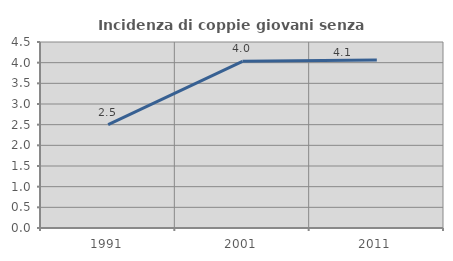
| Category | Incidenza di coppie giovani senza figli |
|---|---|
| 1991.0 | 2.5 |
| 2001.0 | 4.032 |
| 2011.0 | 4.065 |